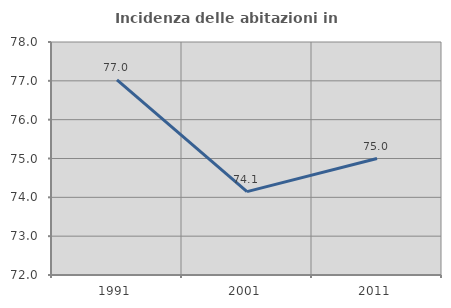
| Category | Incidenza delle abitazioni in proprietà  |
|---|---|
| 1991.0 | 77.023 |
| 2001.0 | 74.148 |
| 2011.0 | 75 |